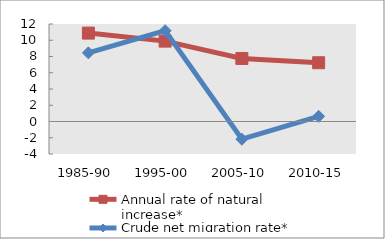
| Category | Annual rate of natural increase* | Crude net migration rate* |
|---|---|---|
| 1985-90 | 10.88 | 8.448 |
| 1995-00 | 9.893 | 11.178 |
| 2005-10 | 7.757 | -2.179 |
| 2010-15 | 7.232 | 0.632 |